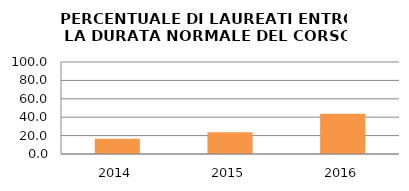
| Category | 2014 2015 2016 |
|---|---|
| 2014.0 | 16.667 |
| 2015.0 | 23.529 |
| 2016.0 | 43.75 |